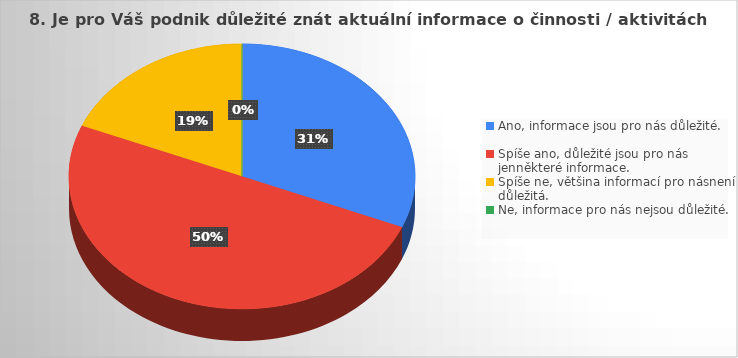
| Category | Series 0 |
|---|---|
| Ano, informace jsou pro nás důležité. | 5 |
| Spíše ano, důležité jsou pro nás jenněkteré informace. | 8 |
| Spíše ne, většina informací pro násnení důležitá. | 3 |
| Ne, informace pro nás nejsou důležité. | 0 |